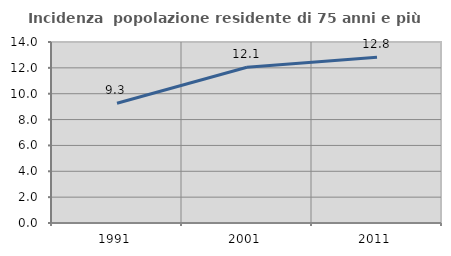
| Category | Incidenza  popolazione residente di 75 anni e più |
|---|---|
| 1991.0 | 9.261 |
| 2001.0 | 12.051 |
| 2011.0 | 12.816 |